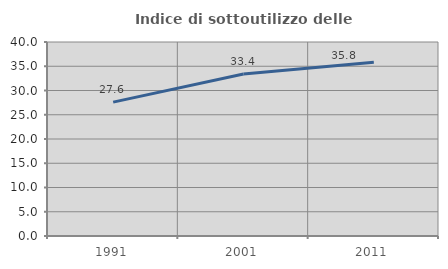
| Category | Indice di sottoutilizzo delle abitazioni  |
|---|---|
| 1991.0 | 27.606 |
| 2001.0 | 33.413 |
| 2011.0 | 35.838 |